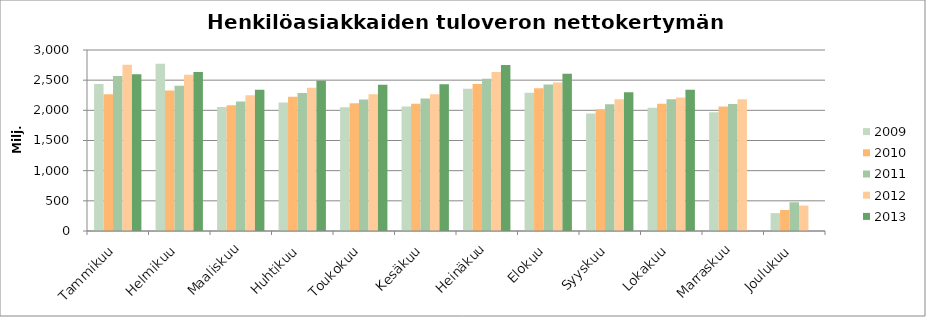
| Category | 2009 | 2010 | 2011 | 2012 | 2013 |
|---|---|---|---|---|---|
| Tammikuu | 2438.489 | 2267.873 | 2569.442 | 2754.468 | 2597.268 |
| Helmikuu | 2771.607 | 2330.409 | 2406.04 | 2591.616 | 2636.607 |
| Maaliskuu | 2054.852 | 2084.249 | 2145.291 | 2250.057 | 2340.316 |
| Huhtikuu | 2131.066 | 2225.487 | 2285.914 | 2375.631 | 2492.368 |
| Toukokuu | 2051.558 | 2117.095 | 2177.688 | 2264.689 | 2423.516 |
| Kesäkuu | 2063.182 | 2109.339 | 2194.481 | 2268.001 | 2432.777 |
| Heinäkuu | 2357.008 | 2435.026 | 2524.383 | 2633.57 | 2750.145 |
| Elokuu | 2289.863 | 2364.596 | 2427.052 | 2461.949 | 2607.529 |
| Syyskuu | 1946.167 | 2019.118 | 2102.001 | 2184.152 | 2299.363 |
| Lokakuu | 2041.676 | 2107.95 | 2185.045 | 2211.144 | 2342.648 |
| Marraskuu | 1967.798 | 2063.457 | 2106.752 | 2183.43 | 0 |
| Joulukuu | 296.354 | 347.927 | 476.484 | 421.857 | 0 |